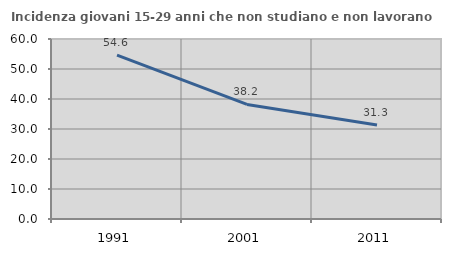
| Category | Incidenza giovani 15-29 anni che non studiano e non lavorano  |
|---|---|
| 1991.0 | 54.594 |
| 2001.0 | 38.196 |
| 2011.0 | 31.333 |